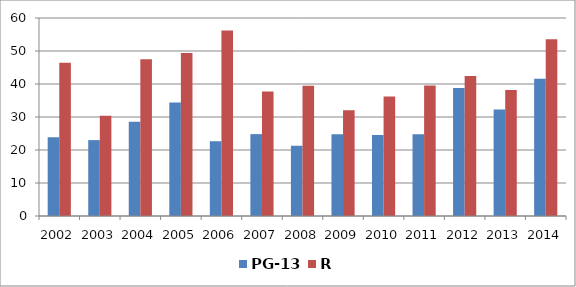
| Category | PG-13 | R |
|---|---|---|
| 2002.0 | 23.857 | 46.441 |
| 2003.0 | 23 | 30.366 |
| 2004.0 | 28.582 | 47.484 |
| 2005.0 | 34.386 | 49.425 |
| 2006.0 | 22.63 | 56.238 |
| 2007.0 | 24.811 | 37.741 |
| 2008.0 | 21.32 | 39.469 |
| 2009.0 | 24.771 | 32.029 |
| 2010.0 | 24.565 | 36.176 |
| 2011.0 | 24.8 | 39.577 |
| 2012.0 | 38.767 | 42.425 |
| 2013.0 | 32.292 | 38.213 |
| 2014.0 | 41.607 | 53.593 |